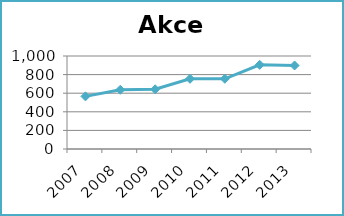
| Category | Akce |
|---|---|
| 2007.0 | 566 |
| 2008.0 | 637 |
| 2009.0 | 642 |
| 2010.0 | 755 |
| 2011.0 | 755 |
| 2012.0 | 905 |
| 2013.0 | 898 |